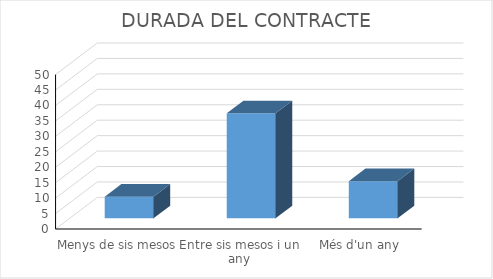
| Category | Series 0 |
|---|---|
| Menys de sis mesos | 7 |
| Entre sis mesos i un any | 34 |
| Més d'un any | 12 |